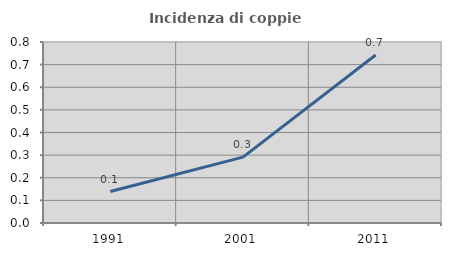
| Category | Incidenza di coppie miste |
|---|---|
| 1991.0 | 0.139 |
| 2001.0 | 0.291 |
| 2011.0 | 0.743 |